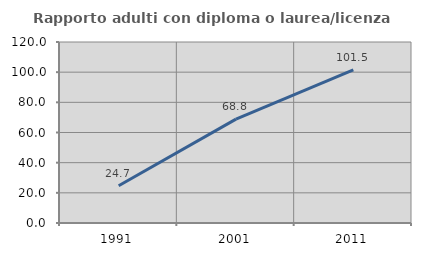
| Category | Rapporto adulti con diploma o laurea/licenza media  |
|---|---|
| 1991.0 | 24.706 |
| 2001.0 | 68.841 |
| 2011.0 | 101.471 |